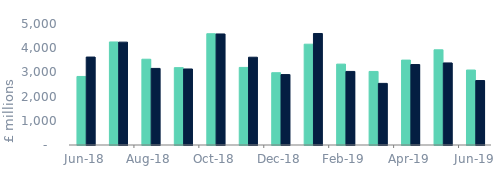
| Category | Full market | Remortgage without equity withdrawn |
|---|---|---|
| 2018-06-01 | 2832.478 | 3633.812 |
| 2018-07-01 | 4257.972 | 4250.837 |
| 2018-08-01 | 3544.11 | 3164.571 |
| 2018-09-01 | 3196.659 | 3141.536 |
| 2018-10-01 | 4598.024 | 4589.26 |
| 2018-11-01 | 3205.305 | 3627.525 |
| 2018-12-01 | 2986.944 | 2910.086 |
| 2019-01-01 | 4165.38 | 4607.507 |
| 2019-02-01 | 3342.012 | 3040.269 |
| 2019-03-01 | 3039.602 | 2546.033 |
| 2019-04-01 | 3507.966 | 3324.642 |
| 2019-05-01 | 3933.79 | 3390.654 |
| 2019-06-01 | 3098.025 | 2663.533 |